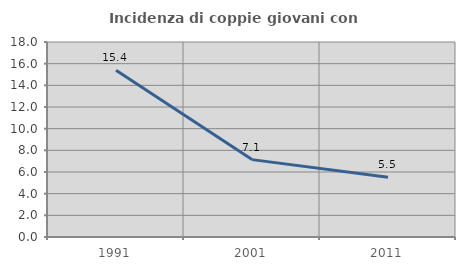
| Category | Incidenza di coppie giovani con figli |
|---|---|
| 1991.0 | 15.385 |
| 2001.0 | 7.143 |
| 2011.0 | 5.525 |